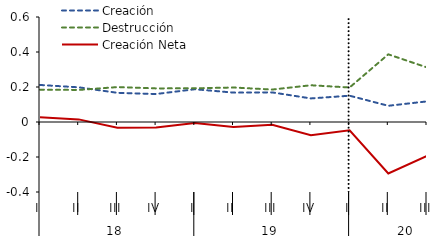
| Category | Creación | Destrucción | Creación Neta |
|---|---|---|---|
| 0 | 0.212 | 0.184 | 0.027 |
| 1 | 0.198 | 0.183 | 0.015 |
| 2 | 0.167 | 0.2 | -0.033 |
| 3 | 0.16 | 0.192 | -0.032 |
| 4 | 0.187 | 0.193 | -0.005 |
| 5 | 0.168 | 0.197 | -0.029 |
| 6 | 0.169 | 0.185 | -0.016 |
| 7 | 0.135 | 0.21 | -0.075 |
| 8 | 0.15 | 0.197 | -0.047 |
| 9 | 0.093 | 0.387 | -0.294 |
| 10 | 0.118 | 0.312 | -0.194 |